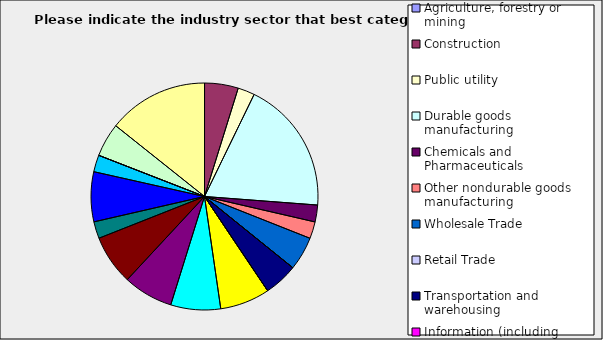
| Category | Series 0 |
|---|---|
| Agriculture, forestry or mining | 0 |
| Construction | 0.048 |
| Public utility | 0.024 |
| Durable goods manufacturing | 0.19 |
| Chemicals and Pharmaceuticals | 0.024 |
| Other nondurable goods manufacturing | 0.024 |
| Wholesale Trade | 0.048 |
| Retail Trade | 0 |
| Transportation and warehousing | 0.048 |
| Information (including broadcasting and telecommunication) | 0 |
| Finance and Insurance | 0.071 |
| Real Estate | 0.071 |
| Professional, scientific and technical services | 0.071 |
| Consulting | 0.071 |
| Administrative and office services (including waste management) | 0.024 |
| Education | 0.071 |
| Health Care and social services | 0.024 |
| Arts, entertainment and recreation | 0 |
| Accommodation and food services | 0.048 |
| Other | 0.143 |